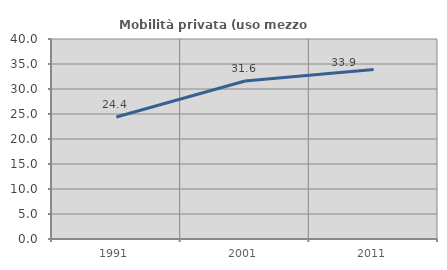
| Category | Mobilità privata (uso mezzo privato) |
|---|---|
| 1991.0 | 24.402 |
| 2001.0 | 31.6 |
| 2011.0 | 33.887 |